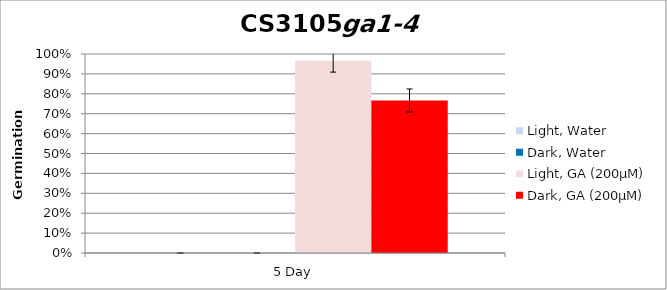
| Category | Light, Water | Dark, Water | Light, GA (200µM) | Dark, GA (200µM) |
|---|---|---|---|---|
| 5 Day | 0 | 0 | 0.967 | 0.767 |